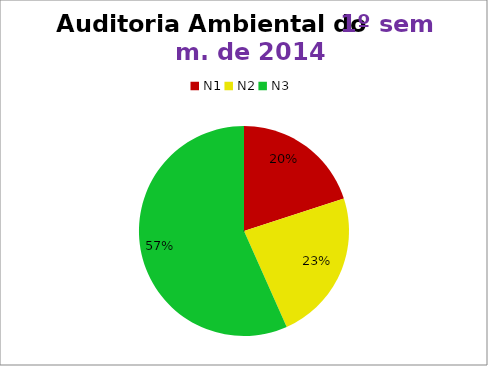
| Category | 1º/14 |
|---|---|
| N1 | 6 |
| N2 | 7 |
| N3 | 17 |